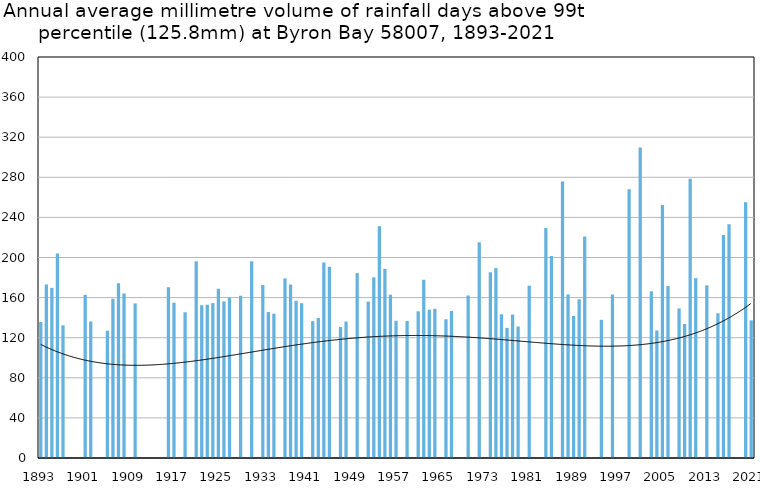
| Category | Annual average mm in days above 99th percentile |
|---|---|
| 1893 | 135.633 |
| 1894 | 173.133 |
| 1895 | 169.7 |
| 1896 | 204 |
| 1897 | 132.35 |
| 1898 | 0 |
| 1899 | 0 |
| 1900 | 0 |
| 1901 | 162.8 |
| 1902 | 136.1 |
| 1903 | 0 |
| 1904 | 0 |
| 1905 | 127 |
| 1906 | 158.8 |
| 1907 | 174.35 |
| 1908 | 164.1 |
| 1909 | 0 |
| 1910 | 154.2 |
| 1911 | 0 |
| 1912 | 0 |
| 1913 | 0 |
| 1914 | 0 |
| 1915 | 0 |
| 1916 | 170.4 |
| 1917 | 154.9 |
| 1918 | 0 |
| 1919 | 145.4 |
| 1920 | 0 |
| 1921 | 196.2 |
| 1922 | 152.4 |
| 1923 | 152.9 |
| 1924 | 154.55 |
| 1925 | 168.9 |
| 1926 | 156.2 |
| 1927 | 160.05 |
| 1928 | 0 |
| 1929 | 161.8 |
| 1930 | 0 |
| 1931 | 196.25 |
| 1932 | 0 |
| 1933 | 172.5 |
| 1934 | 145.6 |
| 1935 | 144 |
| 1936 | 0 |
| 1937 | 179.233 |
| 1938 | 173.1 |
| 1939 | 156.85 |
| 1940 | 154.4 |
| 1941 | 0 |
| 1942 | 136.5 |
| 1943 | 139.7 |
| 1944 | 194.95 |
| 1945 | 190.867 |
| 1946 | 0 |
| 1947 | 130.6 |
| 1948 | 136.1 |
| 1949 | 0 |
| 1950 | 184.4 |
| 1951 | 0 |
| 1952 | 156 |
| 1953 | 180.25 |
| 1954 | 231.3 |
| 1955 | 188.7 |
| 1956 | 162.8 |
| 1957 | 136.9 |
| 1958 | 0 |
| 1959 | 136.7 |
| 1960 | 0 |
| 1961 | 146.3 |
| 1962 | 177.8 |
| 1963 | 148 |
| 1964 | 148.8 |
| 1965 | 0 |
| 1966 | 138.4 |
| 1967 | 146.733 |
| 1968 | 0 |
| 1969 | 0 |
| 1970 | 162.1 |
| 1971 | 0 |
| 1972 | 215.133 |
| 1973 | 0 |
| 1974 | 185.267 |
| 1975 | 189.4 |
| 1976 | 143.35 |
| 1977 | 129.8 |
| 1978 | 143.1 |
| 1979 | 131.2 |
| 1980 | 0 |
| 1981 | 171.9 |
| 1982 | 0 |
| 1983 | 0 |
| 1984 | 229.467 |
| 1985 | 201.55 |
| 1986 | 0 |
| 1987 | 275.9 |
| 1988 | 163.25 |
| 1989 | 141.6 |
| 1990 | 158.3 |
| 1991 | 220.95 |
| 1992 | 0 |
| 1993 | 0 |
| 1994 | 137.85 |
| 1995 | 0 |
| 1996 | 163.1 |
| 1997 | 0 |
| 1998 | 0 |
| 1999 | 268.2 |
| 2000 | 0 |
| 2001 | 309.8 |
| 2002 | 0 |
| 2003 | 166.3 |
| 2004 | 127.2 |
| 2005 | 252.4 |
| 2006 | 171.533 |
| 2007 | 0 |
| 2008 | 149.2 |
| 2009 | 133.7 |
| 2010 | 278.5 |
| 2011 | 179.4 |
| 2012 | 0 |
| 2013 | 172.2 |
| 2014 | 0 |
| 2015 | 144.4 |
| 2016 | 222.4 |
| 2017 | 233.2 |
| 2018 | 0 |
| 2019 | 0 |
| 2020 | 255.2 |
| 2021 | 137.3 |